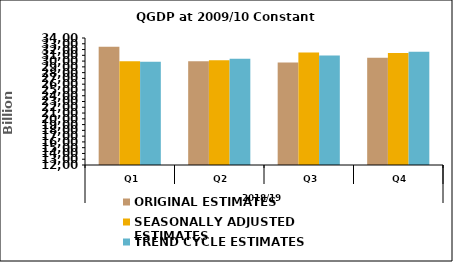
| Category | ORIGINAL ESTIMATES | SEASONALLY ADJUSTED ESTIMATES | TREND CYCLE ESTIMATES |
|---|---|---|---|
| 0 | 32485.712 | 29982.111 | 29871.4 |
| 1 | 29958.477 | 30128.173 | 30385.246 |
| 2 | 29774.014 | 31468.772 | 30972.646 |
| 3 | 30568.4 | 31405.512 | 31625.258 |